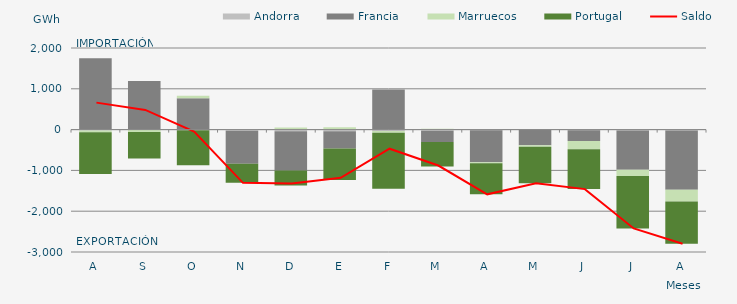
| Category | Andorra | Francia | Marruecos | Portugal |
|---|---|---|---|---|
| A | -19.02 | 1750.608 | -45.265 | -1025.301 |
| S | -11.131 | 1193.426 | -45.19 | -654.794 |
| O | -15.195 | 769.066 | 59.008 | -860.78 |
| N | -28.632 | -809.352 | -1.998 | -465.164 |
| D | -40.654 | -959.109 | 48.514 | -372.253 |
| E | -38.484 | -427.138 | 57.119 | -771.475 |
| F | -34.803 | 984.059 | -44.168 | -1373 |
| M | -31.125 | -269.835 | 22.023 | -601.362 |
| A | -16.536 | -782.902 | -22.588 | -764.882 |
| M | -5.354 | -378.945 | -37.987 | -891.537 |
| J | -16.539 | -262.937 | -205.078 | -974.176 |
| J | -22.256 | -963.789 | -152.863 | -1283.78 |
| A | -20.355 | -1451.936 | -291.598 | -1034.215 |